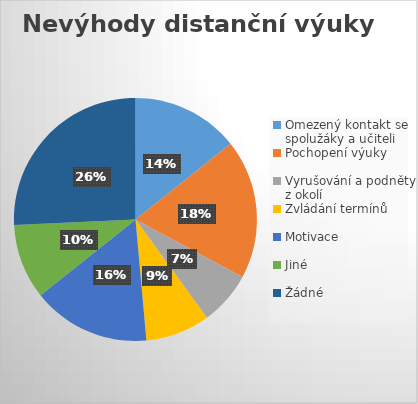
| Category | Series 0 |
|---|---|
| Omezený kontakt se spolužáky a učiteli | 10 |
| Pochopení výuky | 13 |
| Vyrušování a podněty z okolí | 5 |
| Zvládání termínů | 6 |
| Motivace | 11 |
| Jiné | 7 |
| Žádné | 18 |